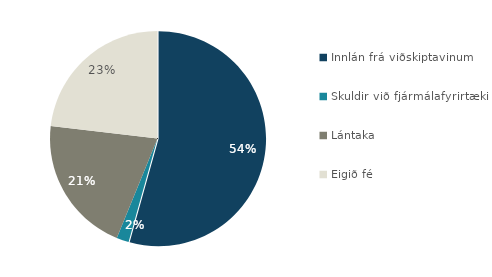
| Category | Series 0 |
|---|---|
| Innlán frá viðskiptavinum | 589725 |
| Skuldir við fjármálafyrirtæki | 20093 |
| Lántaka | 224332 |
| Eigið fé | 251231 |